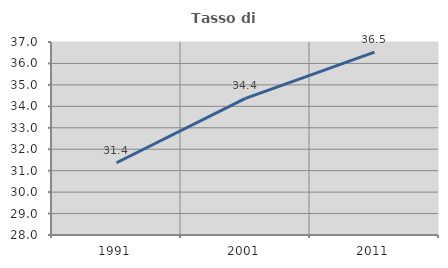
| Category | Tasso di occupazione   |
|---|---|
| 1991.0 | 31.369 |
| 2001.0 | 34.367 |
| 2011.0 | 36.525 |